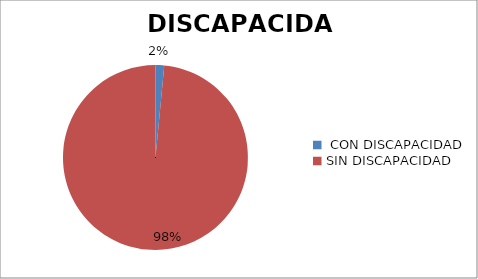
| Category | Series 0 | Series 1 |
|---|---|---|
|  CON DISCAPACIDAD  | 1471 |  |
| SIN DISCAPACIDAD  | 95816 |  |